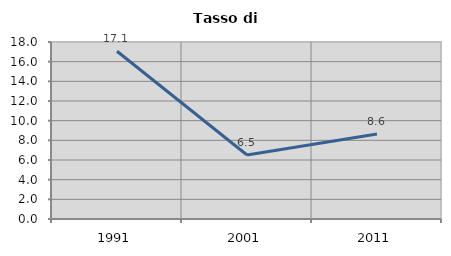
| Category | Tasso di disoccupazione   |
|---|---|
| 1991.0 | 17.058 |
| 2001.0 | 6.506 |
| 2011.0 | 8.647 |